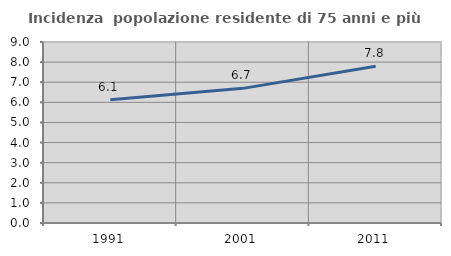
| Category | Incidenza  popolazione residente di 75 anni e più |
|---|---|
| 1991.0 | 6.125 |
| 2001.0 | 6.695 |
| 2011.0 | 7.793 |